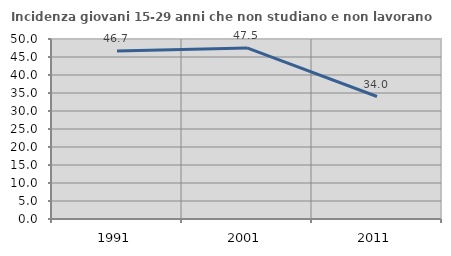
| Category | Incidenza giovani 15-29 anni che non studiano e non lavorano  |
|---|---|
| 1991.0 | 46.697 |
| 2001.0 | 47.529 |
| 2011.0 | 34.026 |